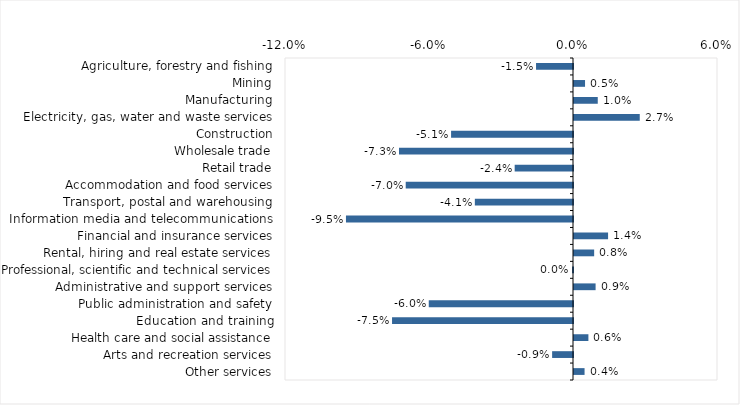
| Category | This week |
|---|---|
| Agriculture, forestry and fishing | -0.015 |
| Mining | 0.005 |
| Manufacturing | 0.01 |
| Electricity, gas, water and waste services | 0.027 |
| Construction | -0.051 |
| Wholesale trade | -0.072 |
| Retail trade | -0.024 |
| Accommodation and food services | -0.07 |
| Transport, postal and warehousing | -0.041 |
| Information media and telecommunications | -0.095 |
| Financial and insurance services | 0.014 |
| Rental, hiring and real estate services | 0.008 |
| Professional, scientific and technical services | 0 |
| Administrative and support services | 0.009 |
| Public administration and safety | -0.06 |
| Education and training | -0.075 |
| Health care and social assistance | 0.006 |
| Arts and recreation services | -0.009 |
| Other services | 0.004 |